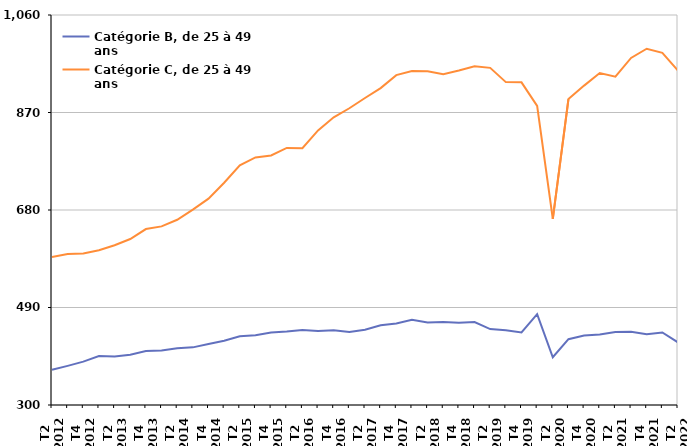
| Category | Catégorie B, de 25 à 49 ans | Catégorie C, de 25 à 49 ans |
|---|---|---|
| T2
2012 | 368.6 | 588.6 |
| T3
2012 | 376.2 | 594.1 |
| T4
2012 | 384.5 | 595.4 |
| T1
2013 | 395.4 | 601.6 |
| T2
2013 | 394.6 | 611.3 |
| T3
2013 | 397.8 | 623.5 |
| T4
2013 | 405.1 | 642.9 |
| T1
2014 | 406.1 | 648.1 |
| T2
2014 | 410.7 | 661 |
| T3
2014 | 412.3 | 680.6 |
| T4
2014 | 418.7 | 702.1 |
| T1
2015 | 425.2 | 733.1 |
| T2
2015 | 434.1 | 767.2 |
| T3
2015 | 435.9 | 782.5 |
| T4
2015 | 441.1 | 786.3 |
| T1
2016 | 443 | 800.9 |
| T2
2016 | 446.2 | 800.3 |
| T3
2016 | 444 | 835 |
| T4
2016 | 445.6 | 860.6 |
| T1
2017 | 442.2 | 878.3 |
| T2
2017 | 446.5 | 898.2 |
| T3
2017 | 455.2 | 917.6 |
| T4
2017 | 458.9 | 942.8 |
| T1
2018 | 466 | 950.9 |
| T2
2018 | 460.6 | 950.3 |
| T3
2018 | 461.6 | 944.8 |
| T4
2018 | 460.3 | 951.8 |
| T1
2019 | 461.6 | 960.1 |
| T2
2019 | 447.9 | 957 |
| T3
2019 | 445.8 | 929.2 |
| T4
2019 | 441.4 | 928.8 |
| T1
2020 | 477 | 882.7 |
| T2
2020 | 393 | 662.9 |
| T3
2020 | 428.3 | 896.1 |
| T4
2020 | 435.4 | 922.4 |
| T1
2021 | 437.4 | 946.9 |
| T2
2021 | 442.2 | 939.7 |
| T3
2021 | 442.9 | 976.4 |
| T4
2021 | 438.1 | 994.3 |
| T1
2022 | 441.3 | 986.2 |
| T2
2022 | 422.1 | 951.8 |